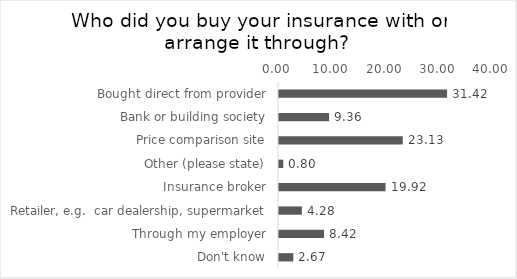
| Category | % of Respondents |
|---|---|
| Bought direct from provider | 31.417 |
| Bank or building society | 9.358 |
| Price comparison site | 23.128 |
| Other (please state) | 0.802 |
| Insurance broker | 19.92 |
| Retailer, e.g.  car dealership, supermarket | 4.278 |
| Through my employer | 8.422 |
| Don't know | 2.674 |